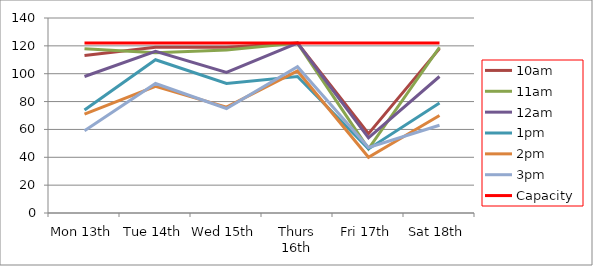
| Category | 9am | 10am | 11am | 12am | 1pm | 2pm | 3pm | 4pm | 5pm | Capacity |
|---|---|---|---|---|---|---|---|---|---|---|
| Mon 13th |  | 113 | 118 | 98 | 74 | 71 | 59 |  |  | 122 |
| Tue 14th |  | 119 | 115 | 116 | 110 | 91 | 93 |  |  | 122 |
| Wed 15th |  | 119 | 117 | 101 | 93 | 76 | 75 |  |  | 122 |
| Thurs 16th |  | 122 | 122 | 122 | 98 | 102 | 105 |  |  | 122 |
| Fri 17th |  | 57 | 46 | 54 | 46 | 40 | 47 |  |  | 122 |
| Sat 18th |  | 118 | 119 | 98 | 79 | 70 | 63 |  |  | 122 |